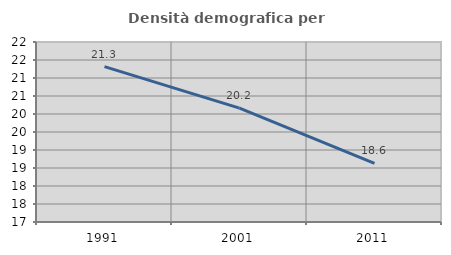
| Category | Densità demografica |
|---|---|
| 1991.0 | 21.317 |
| 2001.0 | 20.164 |
| 2011.0 | 18.627 |